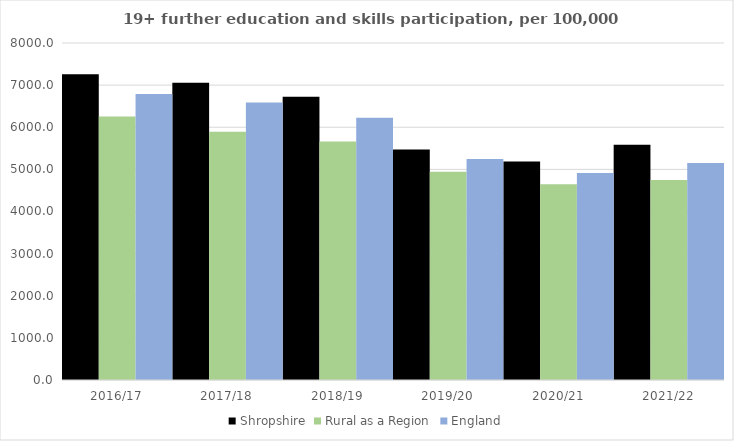
| Category | Shropshire | Rural as a Region | England |
|---|---|---|---|
| 2016/17 | 7261 | 6253.401 | 6788 |
| 2017/18 | 7057 | 5892.029 | 6588 |
| 2018/19 | 6725 | 5661.873 | 6227 |
| 2019/20 | 5470 | 4943.801 | 5244 |
| 2020/21 | 5186 | 4646.727 | 4913 |
| 2021/22 | 5585 | 4747.049 | 5151 |